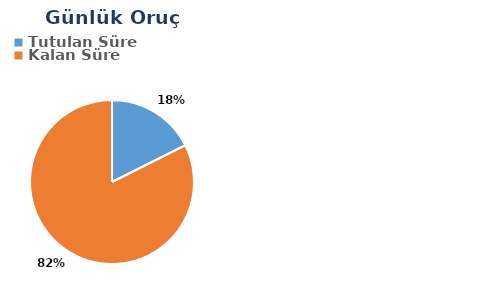
| Category | Günlük |
|---|---|
| Tutulan Süre | -0.158 |
| Kalan Süre | 0.74 |